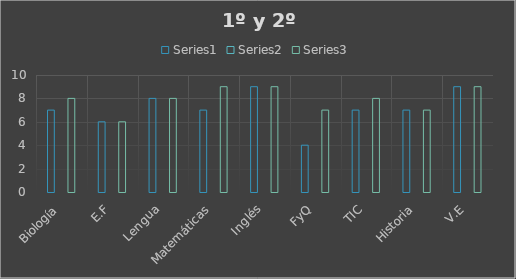
| Category | Series 0 | Series 1 | Series 2 |
|---|---|---|---|
| Biología | 7 | 0 | 8 |
| E.F | 6 | 0 | 6 |
| Lengua | 8 | 0 | 8 |
| Matemáticas | 7 | 0 | 9 |
| Inglés | 9 | 0 | 9 |
| FyQ | 4 | 0 | 7 |
| TIC | 7 | 0 | 8 |
| Historia | 7 | 0 | 7 |
| V.E | 9 | 0 | 9 |